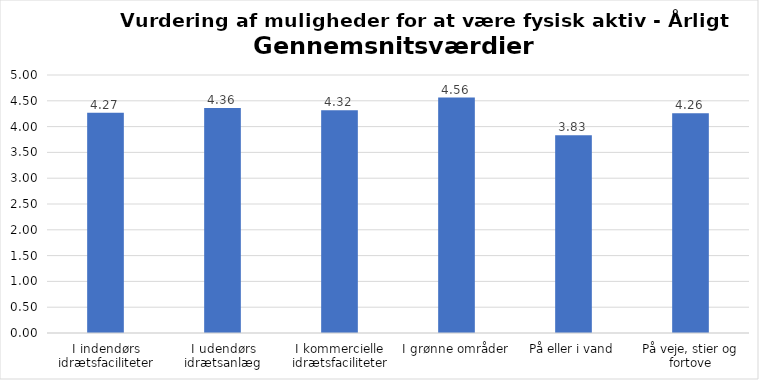
| Category | Gennemsnit |
|---|---|
| I indendørs idrætsfaciliteter | 4.271 |
| I udendørs idrætsanlæg | 4.363 |
| I kommercielle idrætsfaciliteter | 4.317 |
| I grønne områder | 4.564 |
| På eller i vand | 3.831 |
| På veje, stier og fortove | 4.258 |